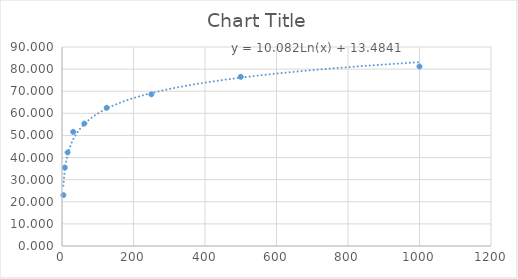
| Category | Series 0 |
|---|---|
| 3.91 | 23.017 |
| 7.81 | 35.459 |
| 15.62 | 42.302 |
| 31.25 | 51.633 |
| 62.5 | 55.365 |
| 125.0 | 62.519 |
| 250.0 | 68.585 |
| 500.0 | 76.516 |
| 1000.0 | 81.182 |